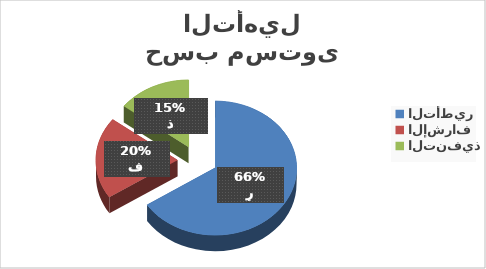
| Category | إناث |
|---|---|
| التأطير | 274 |
| الإشراف | 82 |
| التنفيذ | 61 |